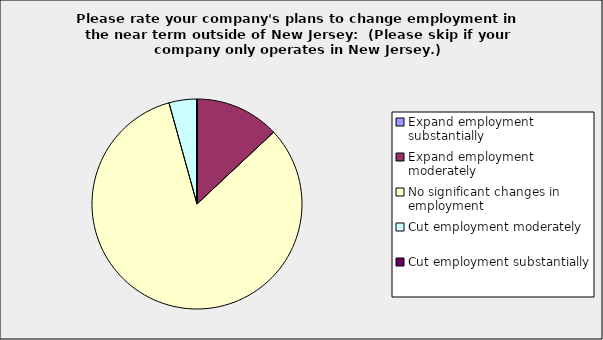
| Category | Series 0 |
|---|---|
| Expand employment substantially | 0 |
| Expand employment moderately | 0.13 |
| No significant changes in employment | 0.826 |
| Cut employment moderately | 0.043 |
| Cut employment substantially | 0 |